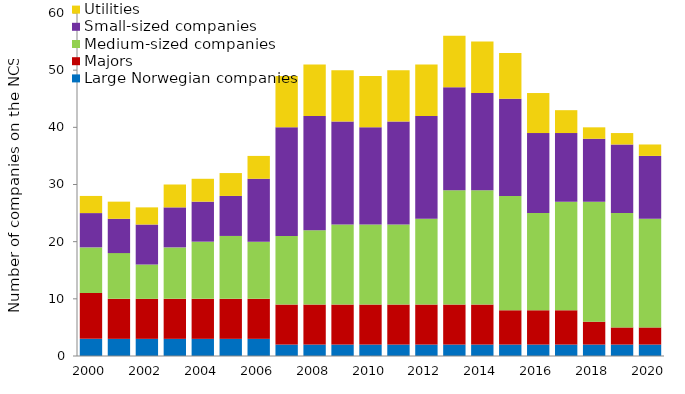
| Category | Large Norwegian companies | Majors | Medium-sized companies | Small-sized companies | Utilities |
|---|---|---|---|---|---|
| 2000.0 | 3 | 8 | 8 | 6 | 3 |
| 2001.0 | 3 | 7 | 8 | 6 | 3 |
| 2002.0 | 3 | 7 | 6 | 7 | 3 |
| 2003.0 | 3 | 7 | 9 | 7 | 4 |
| 2004.0 | 3 | 7 | 10 | 7 | 4 |
| 2005.0 | 3 | 7 | 11 | 7 | 4 |
| 2006.0 | 3 | 7 | 10 | 11 | 4 |
| 2007.0 | 2 | 7 | 12 | 19 | 9 |
| 2008.0 | 2 | 7 | 13 | 20 | 9 |
| 2009.0 | 2 | 7 | 14 | 18 | 9 |
| 2010.0 | 2 | 7 | 14 | 17 | 9 |
| 2011.0 | 2 | 7 | 14 | 18 | 9 |
| 2012.0 | 2 | 7 | 15 | 18 | 9 |
| 2013.0 | 2 | 7 | 20 | 18 | 9 |
| 2014.0 | 2 | 7 | 20 | 17 | 9 |
| 2015.0 | 2 | 6 | 20 | 17 | 8 |
| 2016.0 | 2 | 6 | 17 | 14 | 7 |
| 2017.0 | 2 | 6 | 19 | 12 | 4 |
| 2018.0 | 2 | 4 | 21 | 11 | 2 |
| 2019.0 | 2 | 3 | 20 | 12 | 2 |
| 2020.0 | 2 | 3 | 19 | 11 | 2 |